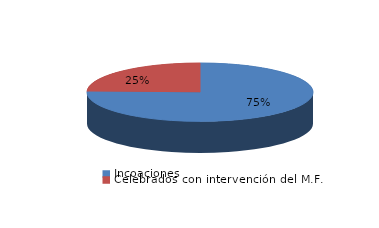
| Category | Series 0 |
|---|---|
| Incoaciones | 1533 |
| Celebrados con intervención del M.F. | 501 |